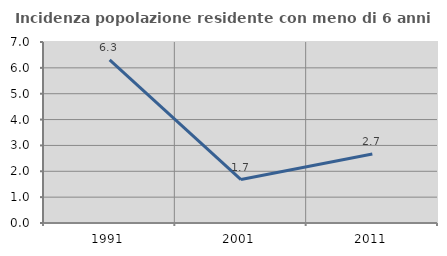
| Category | Incidenza popolazione residente con meno di 6 anni |
|---|---|
| 1991.0 | 6.312 |
| 2001.0 | 1.681 |
| 2011.0 | 2.667 |